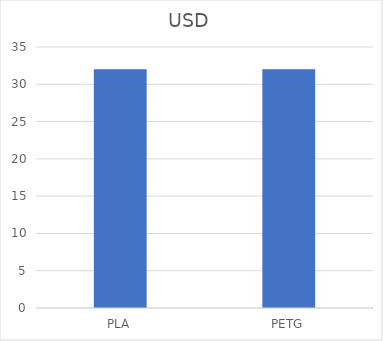
| Category | USD |
|---|---|
| PLA | 32 |
| PETG | 32 |